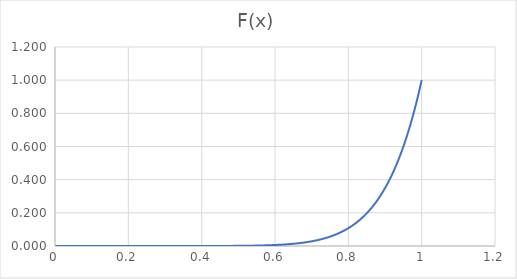
| Category | Series 0 |
|---|---|
| 0.0 | 0 |
| 0.01 | 0 |
| 0.02 | 0 |
| 0.03 | 0 |
| 0.04 | 0 |
| 0.05 | 0 |
| 0.06 | 0 |
| 0.07 | 0 |
| 0.08 | 0 |
| 0.09 | 0 |
| 0.1 | 0 |
| 0.11 | 0 |
| 0.12 | 0 |
| 0.13 | 0 |
| 0.14 | 0 |
| 0.15 | 0 |
| 0.16 | 0 |
| 0.17 | 0 |
| 0.18 | 0 |
| 0.19 | 0 |
| 0.2 | 0 |
| 0.21 | 0 |
| 0.22 | 0 |
| 0.23 | 0 |
| 0.24 | 0 |
| 0.25 | 0 |
| 0.26 | 0 |
| 0.27 | 0 |
| 0.28 | 0 |
| 0.29 | 0 |
| 0.3 | 0 |
| 0.31 | 0 |
| 0.32 | 0 |
| 0.33 | 0 |
| 0.34 | 0 |
| 0.35 | 0 |
| 0.36 | 0 |
| 0.37 | 0 |
| 0.38 | 0 |
| 0.39 | 0 |
| 0.4 | 0 |
| 0.41 | 0 |
| 0.42 | 0 |
| 0.43 | 0 |
| 0.44 | 0 |
| 0.45 | 0 |
| 0.46 | 0 |
| 0.47 | 0.001 |
| 0.48 | 0.001 |
| 0.49 | 0.001 |
| 0.5 | 0.001 |
| 0.51 | 0.001 |
| 0.52 | 0.001 |
| 0.53 | 0.002 |
| 0.54 | 0.002 |
| 0.55 | 0.003 |
| 0.56 | 0.003 |
| 0.57 | 0.004 |
| 0.58 | 0.004 |
| 0.59 | 0.005 |
| 0.6 | 0.006 |
| 0.61 | 0.007 |
| 0.62 | 0.008 |
| 0.63 | 0.01 |
| 0.64 | 0.012 |
| 0.65 | 0.013 |
| 0.66 | 0.016 |
| 0.67 | 0.018 |
| 0.68 | 0.021 |
| 0.69 | 0.024 |
| 0.7 | 0.028 |
| 0.71 | 0.033 |
| 0.72 | 0.037 |
| 0.73 | 0.043 |
| 0.74 | 0.049 |
| 0.75 | 0.056 |
| 0.76 | 0.064 |
| 0.77 | 0.073 |
| 0.78 | 0.083 |
| 0.79 | 0.095 |
| 0.8 | 0.107 |
| 0.81 | 0.122 |
| 0.82 | 0.137 |
| 0.83 | 0.155 |
| 0.84 | 0.175 |
| 0.85 | 0.197 |
| 0.86 | 0.221 |
| 0.87 | 0.248 |
| 0.88 | 0.279 |
| 0.89 | 0.312 |
| 0.9 | 0.349 |
| 0.91 | 0.389 |
| 0.92 | 0.434 |
| 0.93 | 0.484 |
| 0.94 | 0.539 |
| 0.95 | 0.599 |
| 0.96 | 0.665 |
| 0.97 | 0.737 |
| 0.98 | 0.817 |
| 0.99 | 0.904 |
| 1.0 | 1 |